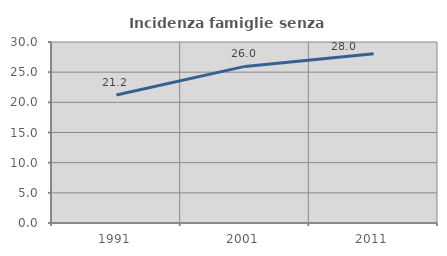
| Category | Incidenza famiglie senza nuclei |
|---|---|
| 1991.0 | 21.226 |
| 2001.0 | 25.957 |
| 2011.0 | 28.033 |